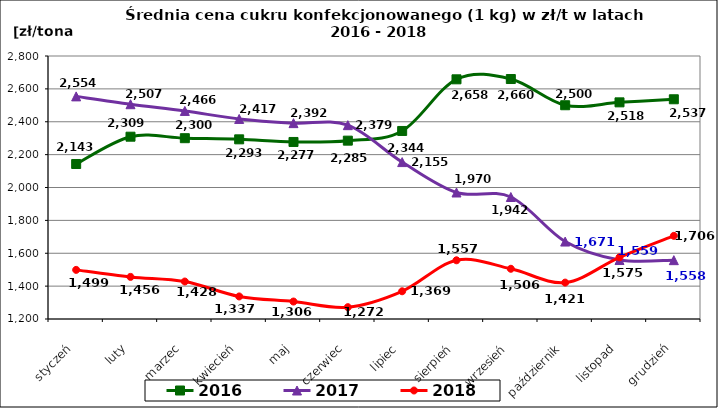
| Category | 2016 | 2017 | 2018 |
|---|---|---|---|
| styczeń | 2143 | 2554.343 | 1498.886 |
| luty | 2309.094 | 2506.703 | 1456.146 |
| marzec | 2300 | 2465.689 | 1427.994 |
| kwiecień | 2293 | 2417.062 | 1337.194 |
| maj | 2277 | 2391.601 | 1306.184 |
| czerwiec | 2285 | 2379.223 | 1272.007 |
| lipiec | 2343.973 | 2154.572 | 1368.668 |
| sierpień | 2658.158 | 1969.609 | 1557.184 |
| wrzesień | 2659.934 | 1942.187 | 1505.537 |
| październik | 2500.386 | 1671.128 | 1421.455 |
| listopad | 2518.035 | 1558.796 | 1575.442 |
| grudzień | 2536.784 | 1557.963 | 1705.916 |